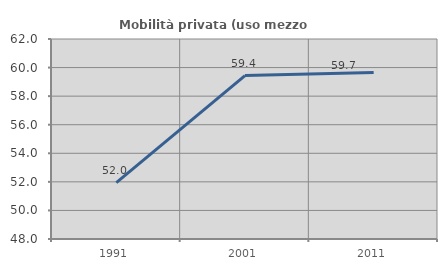
| Category | Mobilità privata (uso mezzo privato) |
|---|---|
| 1991.0 | 51.95 |
| 2001.0 | 59.441 |
| 2011.0 | 59.659 |